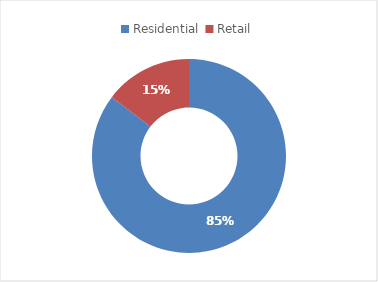
| Category | Series 0 |
|---|---|
| Residential  | 414401 |
| Retail | 71046 |